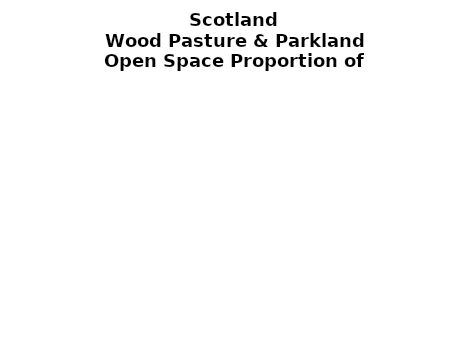
| Category | Wood Pasture & Parkland |
|---|---|
|  ≥ 10ha, < 10%  | 0.04 |
|   ≥ 10ha, 10-25% | 0 |
|   ≥ 10ha, > 25 and <50%  | 0 |
|   ≥ 10ha, ≥ 50%  | 0.449 |
|  < 10ha, < 10% | 0 |
|  < 10ha, 10-25% | 0 |
|  < 10ha, > 25 and < 50% | 0.111 |
|  < 10ha, ≥ 50% | 0.4 |